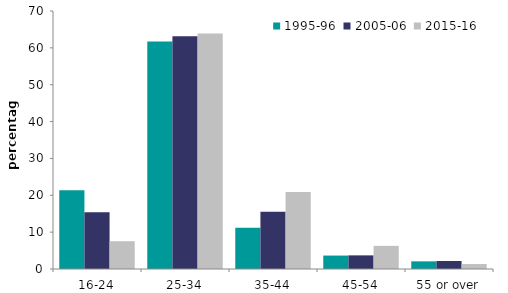
| Category | 1995-96 | 2005-06 | 2015-16 |
|---|---|---|---|
| 16-24 | 21.341 | 15.415 | 7.539 |
| 25-34 | 61.755 | 63.181 | 63.923 |
| 35-44 | 11.178 | 15.541 | 20.911 |
| 45-54 | 3.647 | 3.699 | 6.281 |
| 55 or over | 2.079 | 2.164 | 1.347 |